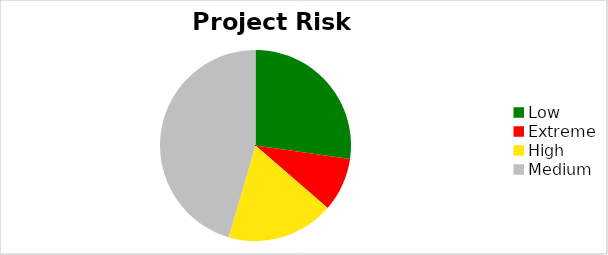
| Category | Series 0 |
|---|---|
| 0 | 0.273 |
| 1 | 0.091 |
| 2 | 0.182 |
| 3 | 0.455 |